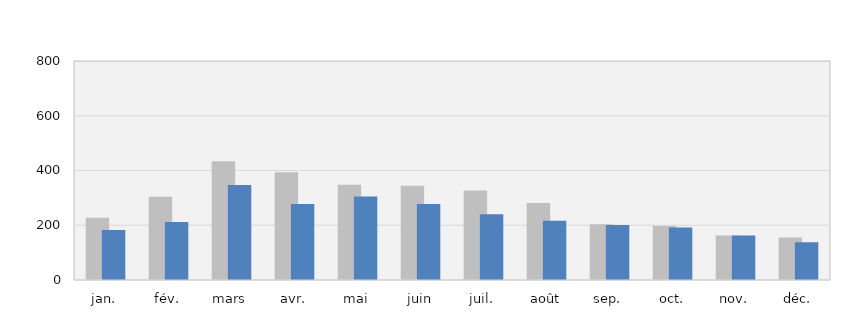
| Category | 2021 | 2022 |
|---|---|---|
| jan. | 227 | 183 |
| fév. | 304 | 212 |
| mars | 434 | 347 |
| avr. | 394 | 278 |
| mai | 348 | 305 |
| juin | 344 | 278 |
| juil. | 327 | 240 |
| août | 281 | 216 |
| sep. | 204 | 201 |
| oct. | 197 | 192 |
| nov. | 163 | 163 |
| déc. | 155 | 138 |